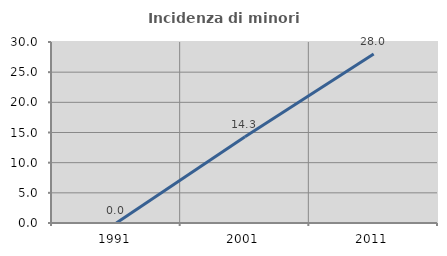
| Category | Incidenza di minori stranieri |
|---|---|
| 1991.0 | 0 |
| 2001.0 | 14.286 |
| 2011.0 | 28 |